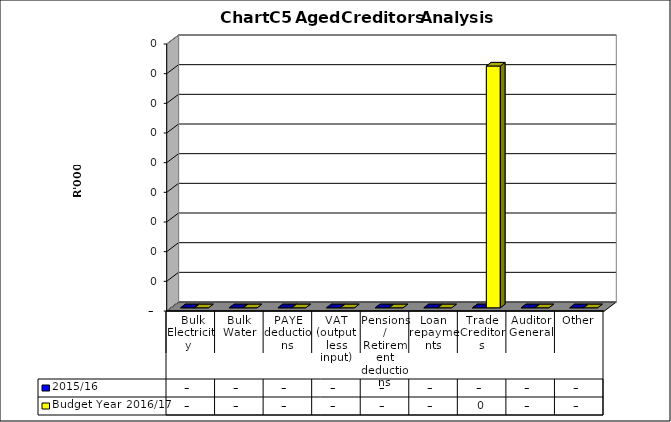
| Category | 2015/16 | Budget Year 2016/17 |
|---|---|---|
|  Bulk Electricity  | 0 | 0 |
| Bulk Water | 0 | 0 |
| PAYE deductions | 0 | 0 |
| VAT (output less input) | 0 | 0 |
| Pensions / Retirement deductions | 0 | 0 |
| Loan repayments | 0 | 0 |
| Trade Creditors | 0 | 163 |
| Auditor General | 0 | 0 |
| Other | 0 | 0 |